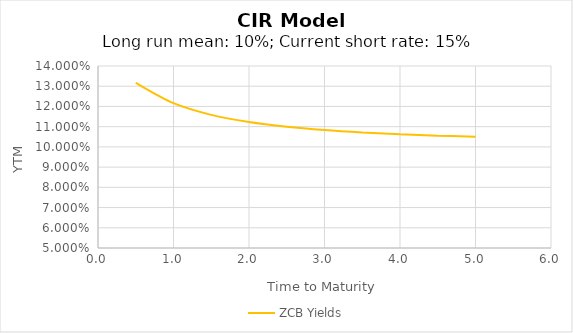
| Category | ZCB Yields |
|---|---|
| 0.5 | 0.132 |
| 1.0 | 0.122 |
| 1.5 | 0.116 |
| 2.0 | 0.112 |
| 2.5 | 0.11 |
| 3.0 | 0.108 |
| 3.5 | 0.107 |
| 4.0 | 0.106 |
| 4.5 | 0.106 |
| 5.0 | 0.105 |